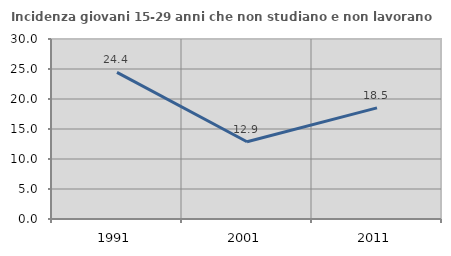
| Category | Incidenza giovani 15-29 anni che non studiano e non lavorano  |
|---|---|
| 1991.0 | 24.444 |
| 2001.0 | 12.868 |
| 2011.0 | 18.519 |